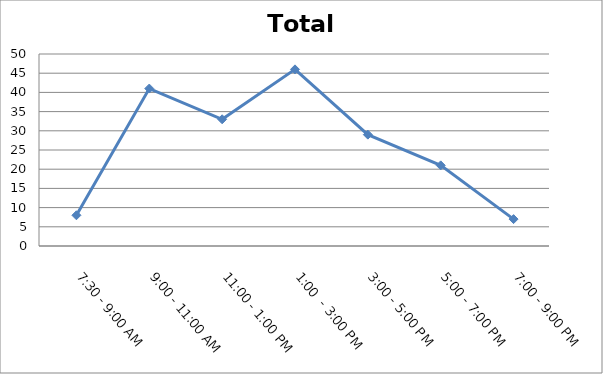
| Category | Total |
|---|---|
| 7:30 - 9:00 AM | 8 |
| 9:00 - 11:00 AM | 41 |
| 11:00 - 1:00 PM | 33 |
| 1:00  - 3:00 PM | 46 |
| 3:00 - 5:00 PM | 29 |
| 5:00 - 7:00 PM | 21 |
| 7:00 - 9:00 PM | 7 |